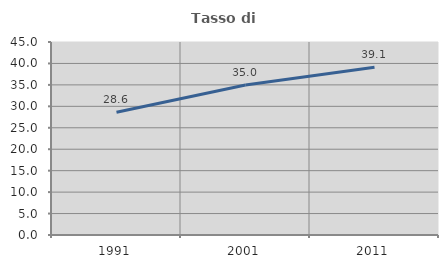
| Category | Tasso di occupazione   |
|---|---|
| 1991.0 | 28.613 |
| 2001.0 | 34.979 |
| 2011.0 | 39.11 |